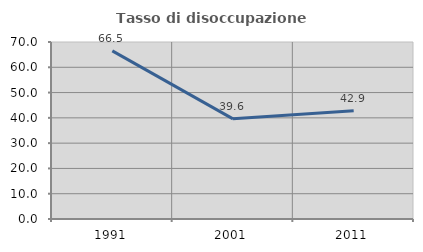
| Category | Tasso di disoccupazione giovanile  |
|---|---|
| 1991.0 | 66.502 |
| 2001.0 | 39.604 |
| 2011.0 | 42.857 |